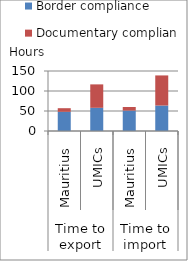
| Category | Border compliance | Documentary compliance |
|---|---|---|
| 0 | 48 | 9 |
| 1 | 57.98 | 58.56 |
| 2 | 51 | 9 |
| 3 | 63.7 | 75.24 |